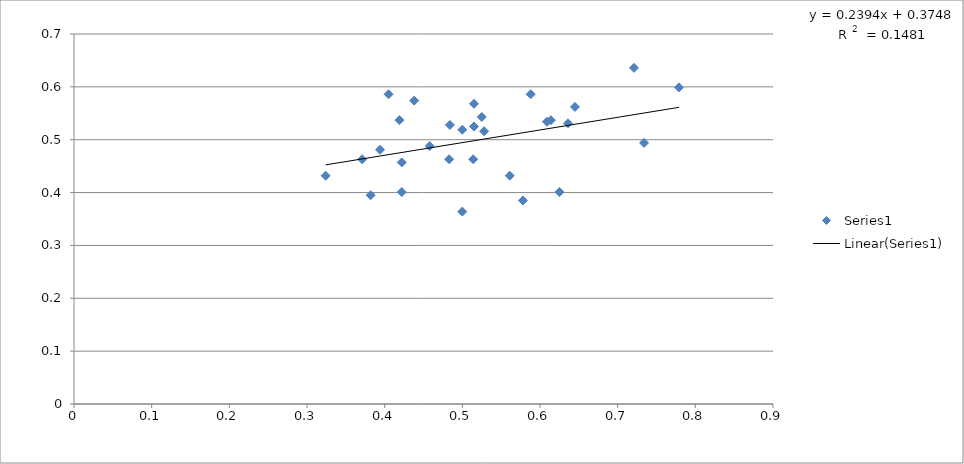
| Category | Series 0 |
|---|---|
| 0.324 | 0.432 |
| 0.636 | 0.531 |
| 0.382 | 0.395 |
| 0.588 | 0.586 |
| 0.528 | 0.516 |
| 0.458 | 0.488 |
| 0.394 | 0.481 |
| 0.422 | 0.401 |
| 0.515 | 0.568 |
| 0.484 | 0.528 |
| 0.419 | 0.537 |
| 0.422 | 0.457 |
| 0.625 | 0.401 |
| 0.779 | 0.599 |
| 0.405 | 0.586 |
| 0.734 | 0.494 |
| 0.609 | 0.534 |
| 0.561 | 0.432 |
| 0.721 | 0.636 |
| 0.514 | 0.463 |
| 0.438 | 0.574 |
| 0.578 | 0.385 |
| 0.371 | 0.463 |
| 0.525 | 0.543 |
| 0.515 | 0.525 |
| 0.645 | 0.562 |
| 0.5 | 0.519 |
| 0.614 | 0.537 |
| 0.483 | 0.463 |
| 0.5 | 0.364 |